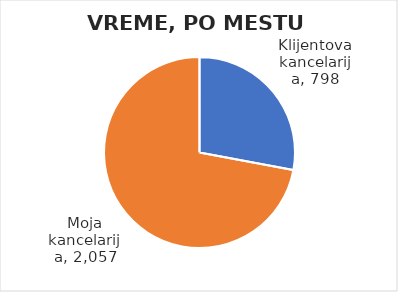
| Category | Ukupno minuta |
|---|---|
| Klijentova kancelarija | 798 |
| Moja kancelarija | 2057 |